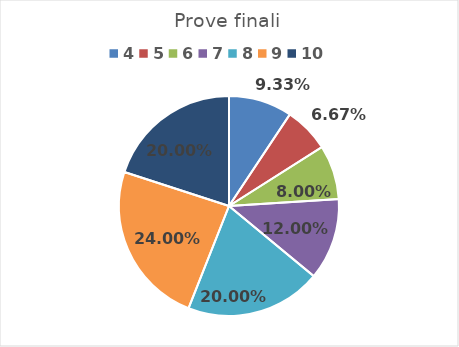
| Category | 1A |
|---|---|
| 4.0 | 0.093 |
| 5.0 | 0.067 |
| 6.0 | 0.08 |
| 7.0 | 0.12 |
| 8.0 | 0.2 |
| 9.0 | 0.24 |
| 10.0 | 0.2 |